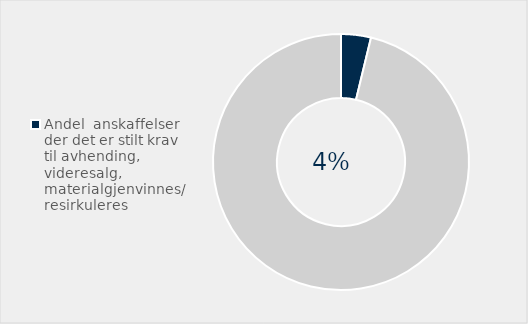
| Category | Series 0 |
|---|---|
| Andel  anskaffelser der det er stilt krav til avhending, videresalg, materialgjenvinnes/resirkuleres | 0.038 |
| Ikke stilt krav  | 0.962 |